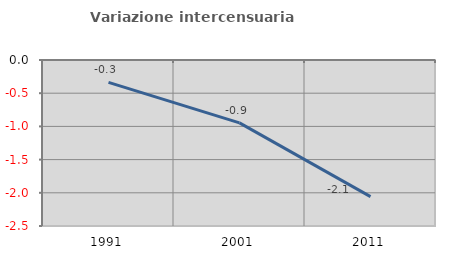
| Category | Variazione intercensuaria annua |
|---|---|
| 1991.0 | -0.337 |
| 2001.0 | -0.946 |
| 2011.0 | -2.058 |